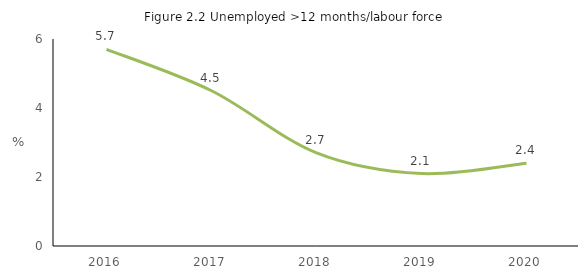
| Category | >12 months/labour force |
|---|---|
| 2016.0 | 5.7 |
| 2017.0 | 4.5 |
| 2018.0 | 2.7 |
| 2019.0 | 2.1 |
| 2020.0 | 2.4 |